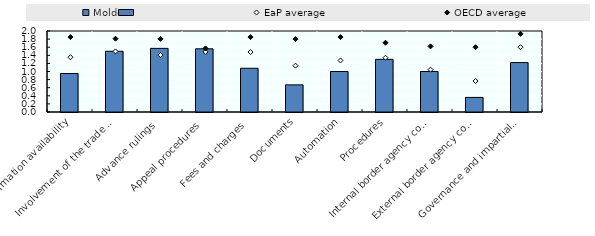
| Category | Moldova |
|---|---|
| Information availability | 0.95 |
| Involvement of the trade community | 1.5 |
| Advance rulings | 1.571 |
| Appeal procedures | 1.56 |
| Fees and charges | 1.08 |
| Documents | 0.67 |
| Automation | 1 |
| Procedures | 1.3 |
| Internal border agency co-operation | 1 |
| External border agency co-operation | 0.36 |
| Governance and impartiality | 1.22 |